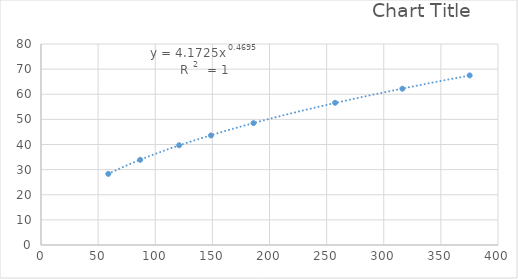
| Category | Series 0 |
|---|---|
| 58.9 | 28.3 |
| 86.8 | 33.9 |
| 120.9 | 39.7 |
| 148.8 | 43.6 |
| 186.0 | 48.5 |
| 257.4 | 56.6 |
| 316.3 | 62.2 |
| 375.2 | 67.5 |